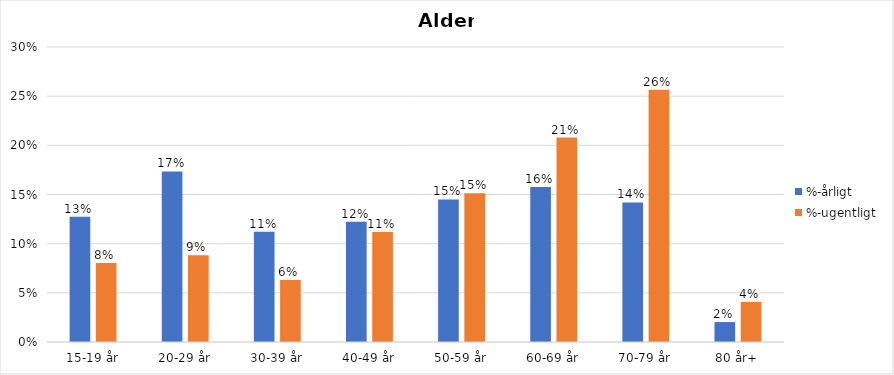
| Category | %-årligt | %-ugentligt |
|---|---|---|
| 15-19 år | 0.127 | 0.08 |
| 20-29 år | 0.173 | 0.088 |
| 30-39 år | 0.112 | 0.063 |
| 40-49 år | 0.122 | 0.112 |
| 50-59 år | 0.145 | 0.151 |
| 60-69 år | 0.158 | 0.208 |
| 70-79 år | 0.142 | 0.257 |
| 80 år+ | 0.02 | 0.041 |